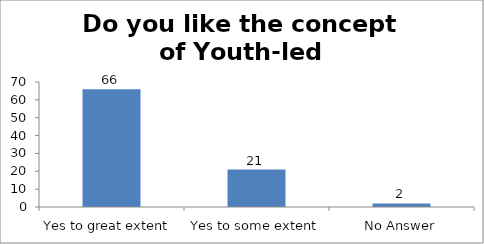
| Category | Do you like the concept of Youth-led Changemaking?  |
|---|---|
| Yes to great extent  | 66 |
| Yes to some extent | 21 |
| No Answer | 2 |